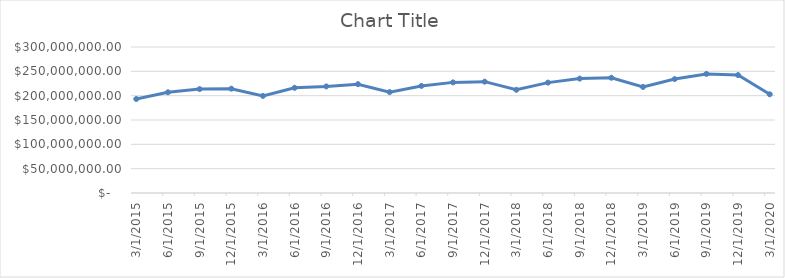
| Category | Series 0 |
|---|---|
| 3/1/15 | 193214760.65 |
| 6/1/15 | 206971890.35 |
| 9/1/15 | 213490881.83 |
| 12/1/15 | 214349105.84 |
| 3/1/16 | 199493745.37 |
| 6/1/16 | 216148419.22 |
| 9/1/16 | 218976889.8 |
| 12/1/16 | 223617895.79 |
| 3/1/17 | 207333812.45 |
| 6/1/17 | 219981727.55 |
| 9/1/17 | 227293496.76 |
| 12/1/17 | 228775828.16 |
| 3/1/18 | 212038702.39 |
| 6/1/18 | 226827967.75 |
| 9/1/18 | 235037993.57 |
| 12/1/18 | 236774885.37 |
| 3/1/19 | 217929233.04 |
| 6/1/19 | 234134611.36 |
| 9/1/19 | 244715476.07 |
| 12/1/19 | 242295832.74 |
| 3/1/20 | 202810254.2 |